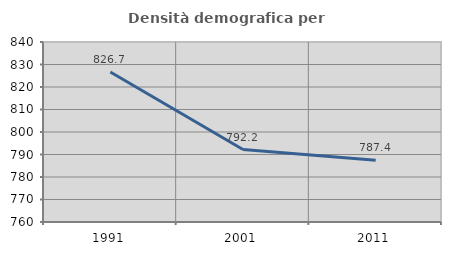
| Category | Densità demografica |
|---|---|
| 1991.0 | 826.667 |
| 2001.0 | 792.214 |
| 2011.0 | 787.413 |